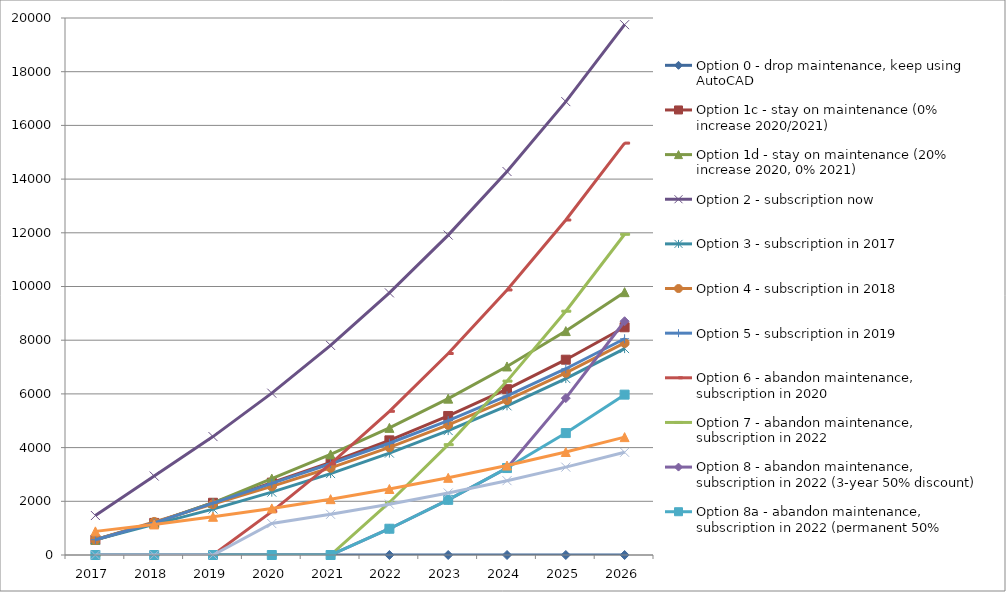
| Category | Option 0 - drop maintenance, keep using AutoCAD | Option 1c - stay on maintenance (0% increase 2020/2021) | Option 1d - stay on maintenance (20% increase 2020, 0% 2021) | Option 2 - subscription now | Option 3 - subscription in 2017 | Option 4 - subscription in 2018 | Option 5 - subscription in 2019 | Option 6 - abandon maintenance, subscription in 2020 | Option 7 - abandon maintenance, subscription in 2022 | Option 8 - abandon maintenance, subscription in 2022 (3-year 50% discount) | Option 8a - abandon maintenance, subscription in 2022 (permanent 50% discount) | Option 9 - BricsCAD Pro with maintenance | Option 10 - BricsCAD Pro with maintenance in 2020 |
|---|---|---|---|---|---|---|---|---|---|---|---|---|---|
| 2017.0 | 0 | 570 | 570 | 1470 | 570 | 570 | 570 | 0 | 0 | 0 | 0 | 880 | 0 |
| 2018.0 | 0 | 1195 | 1195 | 2940 | 1140 | 1231.5 | 1195 | 0 | 0 | 0 | 0 | 1138.5 | 0 |
| 2019.0 | 0 | 1945 | 1945 | 4410 | 1710 | 1893 | 1930 | 0 | 0 | 0 | 0 | 1422.85 | 0 |
| 2020.0 | 0 | 2695 | 2845 | 6027 | 2340 | 2554.5 | 2665 | 1617 | 0 | 0 | 0 | 1735.635 | 1171.28 |
| 2021.0 | 0 | 3445 | 3745 | 7805.7 | 3033 | 3247.5 | 3400 | 3395.7 | 0 | 0 | 0 | 2079.698 | 1515.344 |
| 2022.0 | 0 | 4270 | 4735 | 9762.27 | 3795.3 | 4009.8 | 4162.3 | 5352.27 | 1956.57 | 978.285 | 978.285 | 2458.168 | 1893.813 |
| 2023.0 | 0 | 5177.5 | 5824 | 11914.497 | 4633.83 | 4848.33 | 5000.83 | 7504.497 | 4108.797 | 2054.399 | 2054.399 | 2874.485 | 2310.13 |
| 2024.0 | 0 | 6175.75 | 7021.9 | 14281.947 | 5556.213 | 5770.713 | 5923.213 | 9871.947 | 6476.247 | 3238.123 | 3238.123 | 3332.434 | 2768.079 |
| 2025.0 | 0 | 7273.825 | 8339.59 | 16886.141 | 6570.834 | 6785.334 | 6937.834 | 12476.141 | 9080.441 | 5842.318 | 4540.221 | 3836.177 | 3271.822 |
| 2026.0 | 0 | 8481.708 | 9789.049 | 19750.756 | 7686.918 | 7901.418 | 8053.918 | 15340.756 | 11945.056 | 8706.932 | 5972.528 | 4390.295 | 3825.94 |